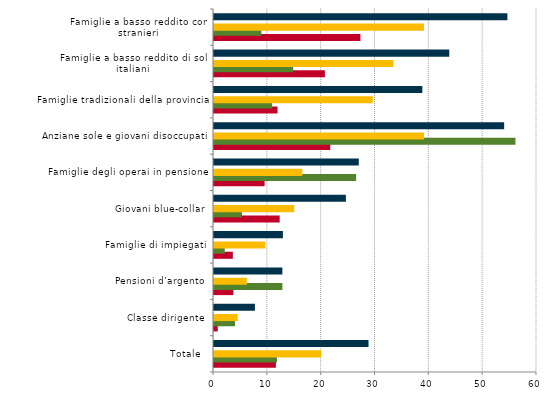
| Category | Grave 
deprivazione | Bassa intensità | Rischio di povertà | Series 4 | Rischio di povertà o 
di esclusione sociale |
|---|---|---|---|---|---|
| Totale  | 11.5 | 11.7 | 19.9 |  | 28.7 |
| Classe dirigente | 0.7 | 3.9 | 4.4 |  | 7.6 |
| Pensioni d’argento | 3.6 | 12.7 | 6.1 |  | 12.7 |
| Famiglie di impiegati | 3.5 | 2 | 9.5 |  | 12.8 |
| Giovani blue-collar | 12.2 | 5.2 | 14.9 |  | 24.5 |
| Famiglie degli operai in pensione | 9.4 | 26.4 | 16.4 |  | 26.9 |
| Anziane sole e giovani disoccupati | 21.6 | 56 | 39 |  | 53.9 |
| Famiglie tradizionali della provincia | 11.8 | 10.8 | 29.5 |  | 38.7 |
| Famiglie a basso reddito di soli italiani | 20.6 | 14.7 | 33.3 |  | 43.7 |
| Famiglie a basso reddito con stranieri | 27.2 | 8.8 | 39 |  | 54.5 |